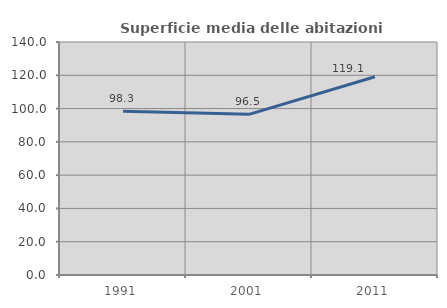
| Category | Superficie media delle abitazioni occupate |
|---|---|
| 1991.0 | 98.34 |
| 2001.0 | 96.516 |
| 2011.0 | 119.115 |